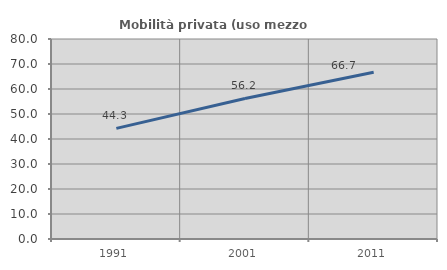
| Category | Mobilità privata (uso mezzo privato) |
|---|---|
| 1991.0 | 44.265 |
| 2001.0 | 56.217 |
| 2011.0 | 66.688 |